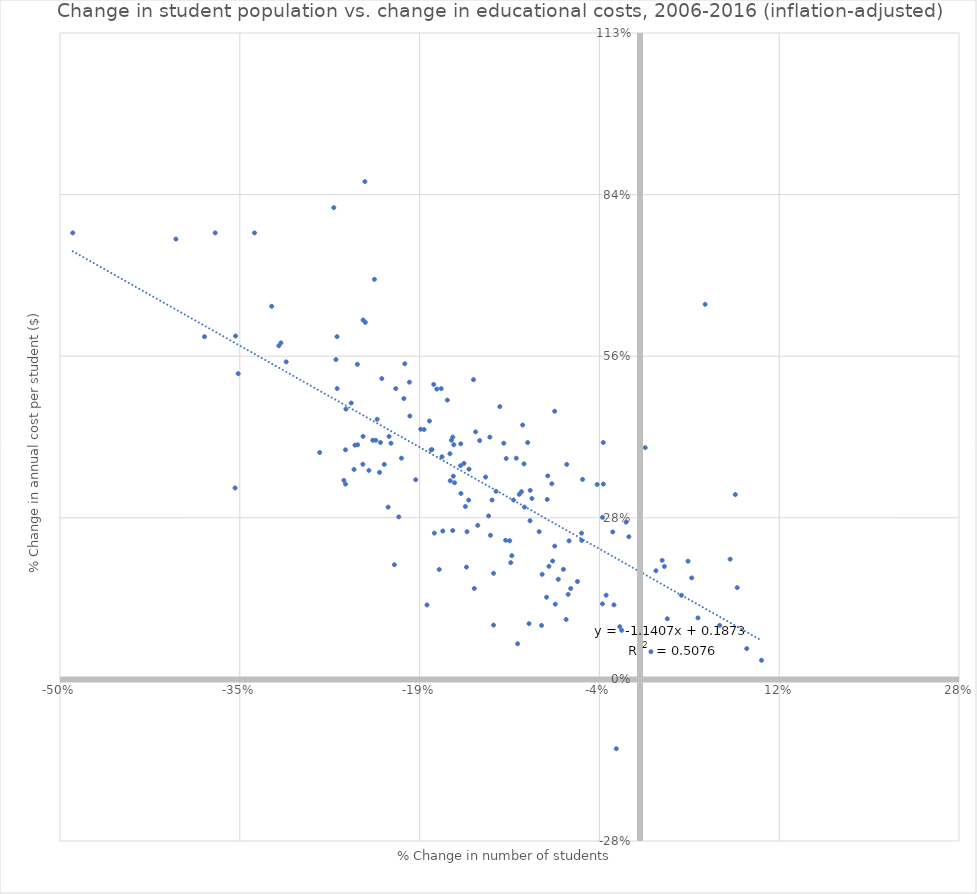
| Category | % change in $ per student, 2006-2016 (inflation-adjusted) |
|---|---|
| -0.216334 | 0.423 |
| -0.100036 | 0.375 |
| -0.305016 | 0.553 |
| -0.031609 | 0.34 |
| -0.154518 | 0.41 |
| -0.129457 | 0.422 |
| -0.138213 | 0.416 |
| -0.214662 | 0.411 |
| -0.086934 | 0.257 |
| -0.375444 | 0.596 |
| -0.181513 | 0.45 |
| -0.193362 | 0.348 |
| -0.203542 | 0.489 |
| -0.151744 | 0.376 |
| -0.080545 | 0.143 |
| -0.488986 | 0.777 |
| -0.078511 | 0.197 |
| -0.126254 | 0.185 |
| -0.09964 | 0.3 |
| -0.12754 | 0.312 |
| -0.348634 | 0.598 |
| -0.224543 | 0.36 |
| -0.032312 | 0.282 |
| -0.211757 | 0.2 |
| -0.147413 | 0.366 |
| -0.163599 | 0.346 |
| -0.14913 | 0.257 |
| -0.160529 | 0.408 |
| -0.207972 | 0.283 |
| -0.248977 | 0.481 |
| -0.400088 | 0.766 |
| -0.189061 | 0.435 |
| 0.068667 | 0.094 |
| 0.104751 | 0.033 |
| 0.082136 | 0.322 |
| -0.094813 | 0.276 |
| -0.012038 | 0.274 |
| -0.210536 | 0.506 |
| 0.004513 | 0.403 |
| -0.22661 | 0.453 |
| -0.073522 | 0.232 |
| -0.032369 | 0.131 |
| -0.150537 | 0.301 |
| -0.12894 | 0.251 |
| -0.26398 | 0.821 |
| -0.346356 | 0.532 |
| -0.120824 | 0.475 |
| 0.083803 | 0.16 |
| -0.1731 | 0.191 |
| -0.166099 | 0.486 |
| 0.092036 | 0.054 |
| -0.049537 | 0.348 |
| -0.183623 | 0.13 |
| -0.096826 | 0.412 |
| -0.162577 | 0.416 |
| -0.139869 | 0.268 |
| -0.02918 | 0.147 |
| -0.112328 | 0.241 |
| -0.105479 | 0.062 |
| -0.106638 | 0.385 |
| -0.063122 | 0.374 |
| -0.094658 | 0.329 |
| -0.349077 | 0.333 |
| -0.06194 | 0.148 |
| -0.233709 | 0.364 |
| -0.108991 | 0.312 |
| -0.198773 | 0.517 |
| -0.262114 | 0.557 |
| -0.124106 | 0.327 |
| -0.220464 | 0.374 |
| -0.228962 | 0.696 |
| -0.161422 | 0.259 |
| -0.311328 | 0.581 |
| -0.261086 | 0.506 |
| -0.059736 | 0.158 |
| -0.236804 | 0.621 |
| -0.050407 | 0.254 |
| -0.06369 | 0.104 |
| -0.053902 | 0.17 |
| -0.084877 | 0.094 |
| -0.031682 | 0.412 |
| -0.171365 | 0.506 |
| -0.050226 | 0.242 |
| -0.179362 | 0.4 |
| -0.243647 | 0.548 |
| -0.217125 | 0.3 |
| -0.230337 | 0.416 |
| -0.160941 | 0.354 |
| 0.009425 | 0.048 |
| 0.019095 | 0.207 |
| -0.205648 | 0.385 |
| -0.104093 | 0.322 |
| -0.017446 | 0.092 |
| 0.021012 | 0.197 |
| -0.170013 | 0.258 |
| -0.076017 | 0.34 |
| -0.186163 | 0.435 |
| -0.25527 | 0.346 |
| -0.245713 | 0.408 |
| -0.238703 | 0.625 |
| -0.180114 | 0.399 |
| -0.12624 | 0.095 |
| 0.049971 | 0.107 |
| -0.079997 | 0.313 |
| -0.14286 | 0.158 |
| -0.143556 | 0.522 |
| -0.079522 | 0.354 |
| -0.009592 | 0.248 |
| -0.095668 | 0.097 |
| -0.084361 | 0.183 |
| -0.177274 | 0.255 |
| -0.222584 | 0.524 |
| -0.015808 | 0.085 |
| -0.149619 | 0.195 |
| -0.161411 | 0.422 |
| -0.070453 | 0.174 |
| -0.170655 | 0.387 |
| -0.102209 | 0.327 |
| 0.077705 | 0.209 |
| -0.366204 | 0.777 |
| -0.238741 | 0.423 |
| -0.243394 | 0.408 |
| -0.253879 | 0.4 |
| -0.093195 | 0.315 |
| -0.317552 | 0.649 |
| -0.111404 | 0.203 |
| -0.253519 | 0.47 |
| -0.159858 | 0.342 |
| -0.163843 | 0.393 |
| -0.17515 | 0.505 |
| -0.223757 | 0.412 |
| -0.022432 | 0.13 |
| -0.020426 | -0.121 |
| -0.198392 | 0.458 |
| 0.02354 | 0.106 |
| -0.06602 | 0.192 |
| -0.133125 | 0.352 |
| -0.061148 | 0.241 |
| -0.073547 | 0.467 |
| -0.276125 | 0.395 |
| -0.309572 | 0.586 |
| -0.154713 | 0.372 |
| -0.115351 | 0.384 |
| -0.023476 | 0.257 |
| 0.056152 | 0.653 |
| -0.110485 | 0.215 |
| -0.101145 | 0.443 |
| -0.141713 | 0.431 |
| -0.227825 | 0.416 |
| -0.332335 | 0.777 |
| 0.035734 | 0.146 |
| -0.115817 | 0.242 |
| -0.202741 | 0.549 |
| 0.01374 | 0.189 |
| -0.07305 | 0.131 |
| -0.237126 | 0.866 |
| -0.075342 | 0.206 |
| 0.044567 | 0.177 |
| 0.041398 | 0.206 |
| -0.24653 | 0.365 |
| -0.03697 | 0.339 |
| -0.253881 | 0.34 |
| -0.117433 | 0.411 |
| -0.154331 | 0.324 |
| -0.177853 | 0.513 |
| -0.23891 | 0.374 |
| -0.13051 | 0.285 |
| -0.261172 | 0.596 |
| -0.147691 | 0.312 |